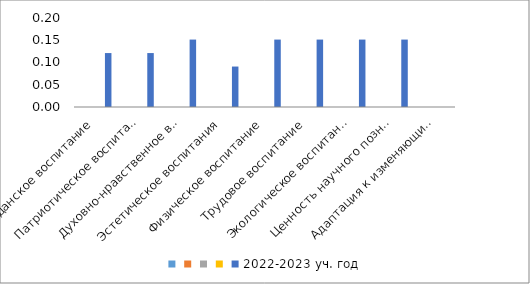
| Category | Series 0 | Series 1 | Series 2 | Series 3 | 2022-2023 уч. год |
|---|---|---|---|---|---|
| Гражданское воспитание |  |  |  |  | 0.121 |
| Патриотическое воспитание |  |  |  |  | 0.121 |
| Духовно-нравственное воспитание |  |  |  |  | 0.152 |
| Эстетическое воспитания |  |  |  |  | 0.091 |
| Физическое воспитание |  |  |  |  | 0.152 |
| Трудовое воспитание |  |  |  |  | 0.152 |
| Экологическое воспитание |  |  |  |  | 0.152 |
| Ценность научного познания |  |  |  |  | 0.152 |
| Адаптация к изменяющимся условиям |  |  |  |  | 0 |